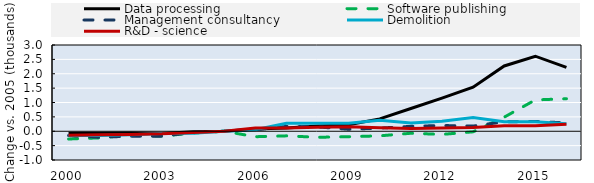
| Category | Data processing | Software publishing | Management consultancy | Demolition | R&D - science |
|---|---|---|---|---|---|
| 2000.0 | -0.07 | -0.27 | -0.15 | -0.15 | -0.14 |
| 2001.0 | -0.07 | -0.23 | -0.21 | -0.15 | -0.12 |
| 2002.0 | -0.06 | -0.13 | -0.17 | -0.12 | -0.11 |
| 2003.0 | -0.08 | -0.17 | -0.17 | -0.08 | -0.09 |
| 2004.0 | -0.02 | -0.06 | -0.04 | -0.07 | -0.04 |
| 2005.0 | 0 | 0 | 0 | 0 | 0 |
| 2006.0 | 0.08 | -0.19 | 0.05 | 0.05 | 0.11 |
| 2007.0 | 0.11 | -0.16 | 0.17 | 0.28 | 0.11 |
| 2008.0 | 0.18 | -0.21 | 0.15 | 0.28 | 0.14 |
| 2009.0 | 0.23 | -0.19 | 0.07 | 0.28 | 0.16 |
| 2010.0 | 0.43 | -0.16 | 0.11 | 0.38 | 0.12 |
| 2011.0 | 0.79 | -0.07 | 0.17 | 0.29 | 0.1 |
| 2012.0 | 1.15 | -0.11 | 0.2 | 0.35 | 0.11 |
| 2013.0 | 1.53 | -0.02 | 0.18 | 0.48 | 0.13 |
| 2014.0 | 2.27 | 0.49 | 0.33 | 0.33 | 0.19 |
| 2015.0 | 2.61 | 1.09 | 0.34 | 0.33 | 0.19 |
| 2016.0 | 2.22 | 1.13 | 0.29 | 0.26 | 0.24 |